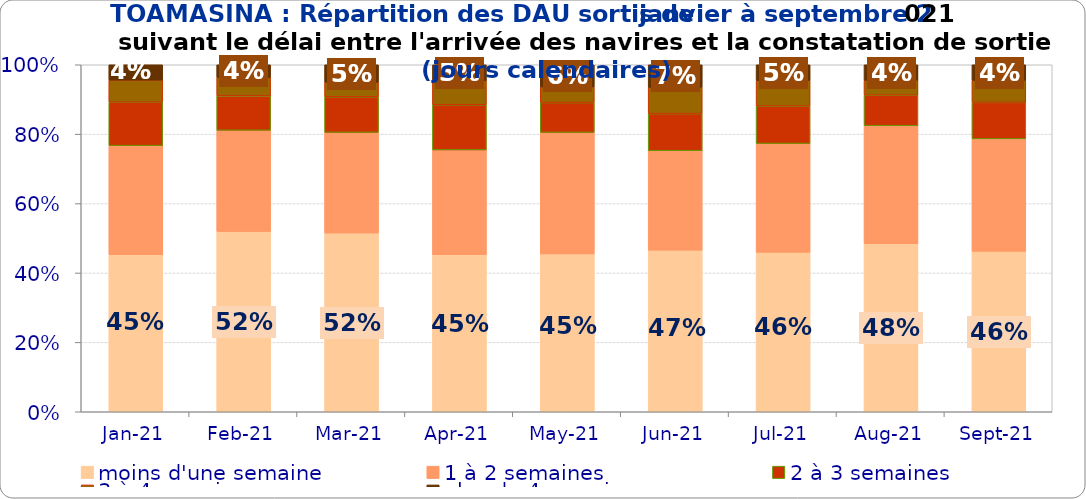
| Category | moins d'une semaine | 1 à 2 semaines | 2 à 3 semaines | 3 à 4 semaines | plus de 4 semaines |
|---|---|---|---|---|---|
| 2021-01-01 | 0.452 | 0.314 | 0.125 | 0.064 | 0.044 |
| 2021-02-01 | 0.519 | 0.292 | 0.099 | 0.053 | 0.037 |
| 2021-03-01 | 0.515 | 0.29 | 0.103 | 0.042 | 0.05 |
| 2021-04-01 | 0.452 | 0.302 | 0.13 | 0.069 | 0.046 |
| 2021-05-01 | 0.455 | 0.35 | 0.086 | 0.045 | 0.064 |
| 2021-06-01 | 0.466 | 0.287 | 0.107 | 0.076 | 0.065 |
| 2021-07-01 | 0.459 | 0.313 | 0.108 | 0.074 | 0.045 |
| 2021-08-01 | 0.484 | 0.34 | 0.088 | 0.043 | 0.044 |
| 2021-09-01 | 0.462 | 0.324 | 0.105 | 0.064 | 0.045 |